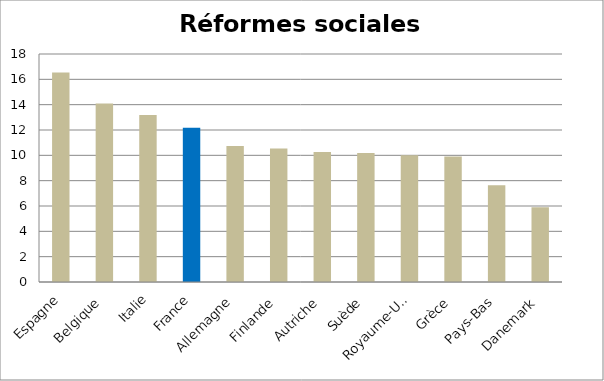
| Category | Series 0 |
|---|---|
| Espagne | 16.545 |
| Belgique | 14.091 |
| Italie | 13.182 |
| France | 12.182 |
| Allemagne | 10.727 |
| Finlande | 10.545 |
| Autriche | 10.273 |
| Suède | 10.182 |
| Royaume-Uni | 10 |
| Grèce | 9.909 |
| Pays-Bas | 7.636 |
| Danemark | 5.909 |